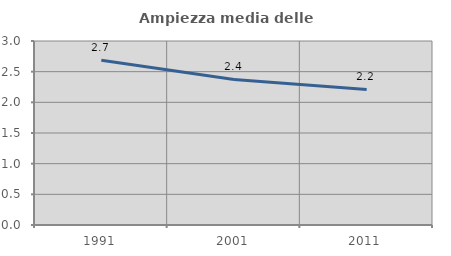
| Category | Ampiezza media delle famiglie |
|---|---|
| 1991.0 | 2.687 |
| 2001.0 | 2.373 |
| 2011.0 | 2.21 |